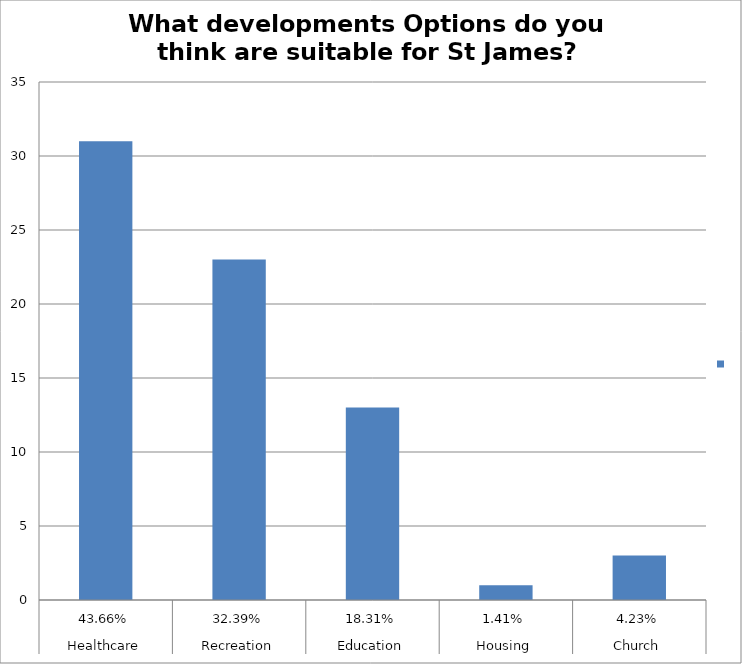
| Category | Series 0 |
|---|---|
| 0 | 31 |
| 1 | 23 |
| 2 | 13 |
| 3 | 1 |
| 4 | 3 |